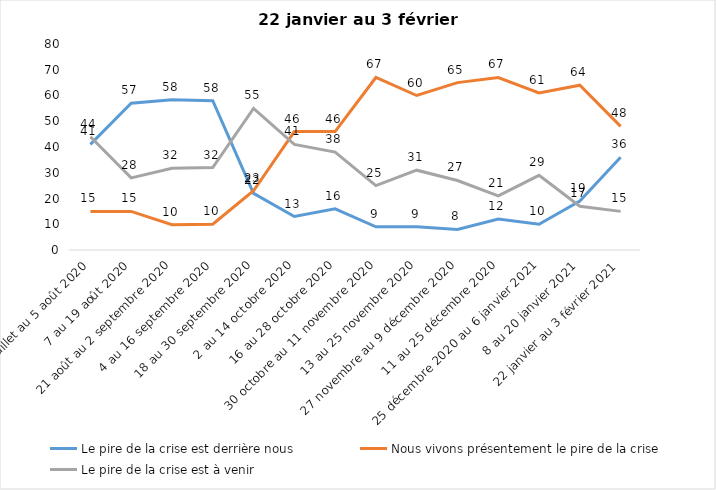
| Category | Le pire de la crise est derrière nous | Nous vivons présentement le pire de la crise | Le pire de la crise est à venir |
|---|---|---|---|
| 24 juillet au 5 août 2020 | 41 | 15 | 44 |
| 7 au 19 août 2020 | 57 | 15 | 28 |
| 21 août au 2 septembre 2020 | 58.39 | 9.84 | 31.77 |
| 4 au 16 septembre 2020 | 58 | 10 | 32 |
| 18 au 30 septembre 2020 | 22 | 23 | 55 |
| 2 au 14 octobre 2020 | 13 | 46 | 41 |
| 16 au 28 octobre 2020 | 16 | 46 | 38 |
| 30 octobre au 11 novembre 2020 | 9 | 67 | 25 |
| 13 au 25 novembre 2020 | 9 | 60 | 31 |
| 27 novembre au 9 décembre 2020 | 8 | 65 | 27 |
| 11 au 25 décembre 2020 | 12 | 67 | 21 |
| 25 décembre 2020 au 6 janvier 2021 | 10 | 61 | 29 |
| 8 au 20 janvier 2021 | 19 | 64 | 17 |
| 22 janvier au 3 février 2021 | 36 | 48 | 15 |